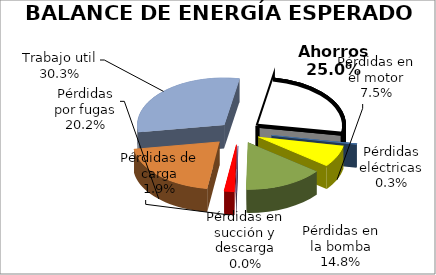
| Category | 5.3  BALANCE DE ENERGÍA ESPERADO | Series 1 | Series 2 |
|---|---|---|---|
| Pérdidas eléctricas | 585.267 |  |  |
| Pérdidas en el motor | 16047.839 |  |  |
| Pérdidas en la bomba | 31844.312 |  |  |
| Pérdidas en succión y descarga | 94.718 |  |  |
| Pérdidas de carga | 4097.636 |  |  |
| Pérdidas por fugas | 43484.082 |  |  |
| Trabajo util | 65226.123 |  |  |
| Ahorros | 53645.317 |  |  |